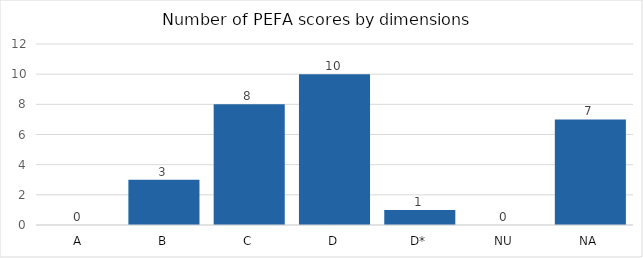
| Category |   | 2021 |
|---|---|---|
| A |  | 0 |
| B |  | 3 |
| C |  | 8 |
| D |  | 10 |
| D* |  | 1 |
| NU |  | 0 |
| NA |  | 7 |